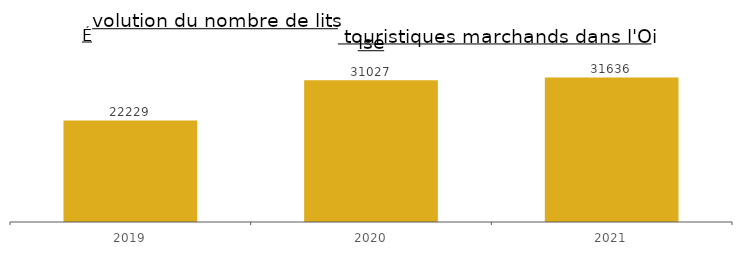
| Category | nombre de lits marchands |
|---|---|
| 2019.0 | 22229 |
| 2020.0 | 31027 |
| 2021.0 | 31636 |